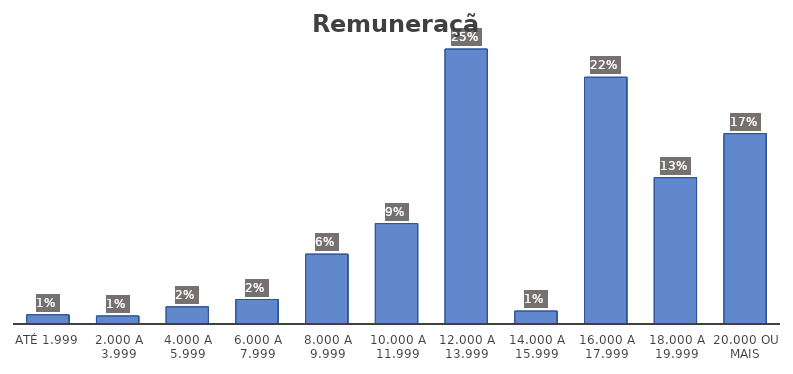
| Category | Series 0 |
|---|---|
| até 1.999 | 0.008 |
| 2.000 a 3.999 | 0.007 |
| 4.000 a 5.999 | 0.016 |
| 6.000 a 7.999 | 0.022 |
| 8.000 a 9.999 | 0.063 |
| 10.000 a 11.999 | 0.091 |
| 12.000 a 13.999 | 0.25 |
| 14.000 a 15.999 | 0.012 |
| 16.000 a 17.999 | 0.224 |
| 18.000 a 19.999 | 0.133 |
| 20.000 ou mais | 0.173 |